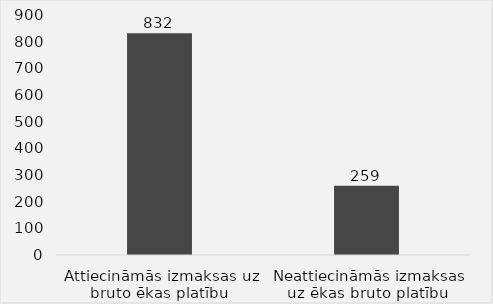
| Category | Series 0 |
|---|---|
| Attiecināmās izmaksas uz bruto ēkas platību  | 832 |
| Neattiecināmās izmaksas uz ēkas bruto platību  | 259.42 |